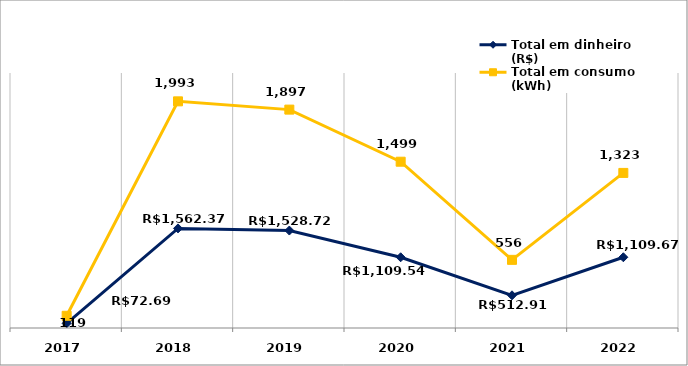
| Category | Total em dinheiro (R$) | Total em consumo (kWh) |
|---|---|---|
| 2017.0 | 72.69 | 119 |
| 2018.0 | 1562.37 | 1993 |
| 2019.0 | 1528.72 | 1897 |
| 2020.0 | 1109.54 | 1499 |
| 2021.0 | 512.91 | 556 |
| 2022.0 | 1109.67 | 1323 |